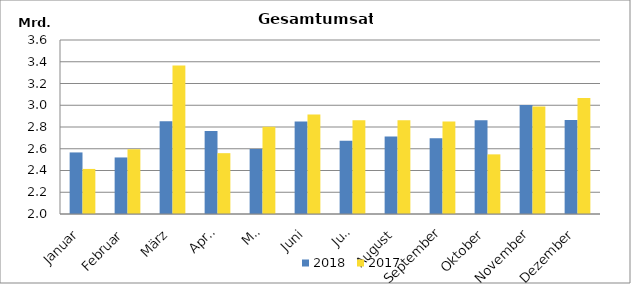
| Category | 2018 | 2017 |
|---|---|---|
| Januar | 2566127.604 | 2414367.225 |
| Februar | 2519904.755 | 2595209.854 |
| März | 2853604.798 | 3365561.344 |
| April | 2762538.618 | 2559301.204 |
| Mai | 2598517.345 | 2801544.958 |
| Juni | 2851189.707 | 2915839.897 |
| Juli | 2672854.699 | 2862531.394 |
| August | 2711584.694 | 2862145.815 |
| September | 2696055.704 | 2849890.841 |
| Oktober | 2862257.549 | 2548336.555 |
| November | 3001435.217 | 2988845.921 |
| Dezember | 2864073.747 | 3065855.171 |